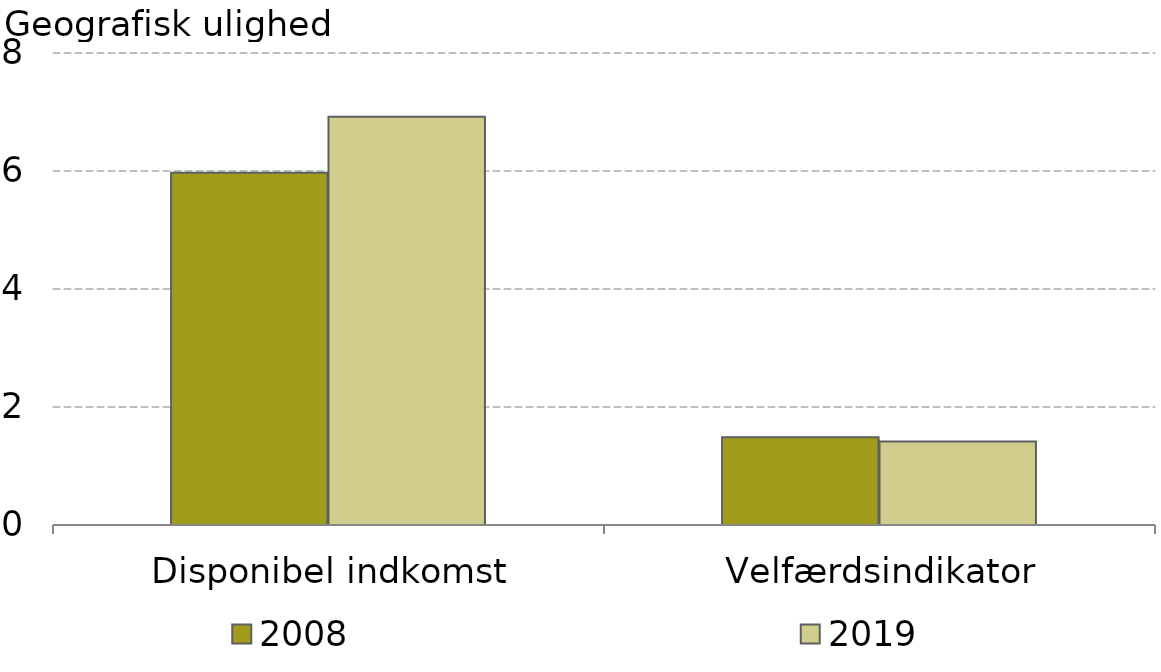
| Category | 2008 | 2019 |
|---|---|---|
|  Disponibel indkomst | 5.97 | 6.921 |
|  Velfærdsindikator | 1.489 | 1.417 |